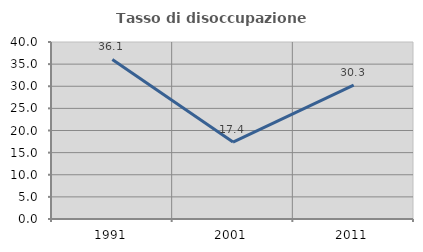
| Category | Tasso di disoccupazione giovanile  |
|---|---|
| 1991.0 | 36.066 |
| 2001.0 | 17.391 |
| 2011.0 | 30.263 |